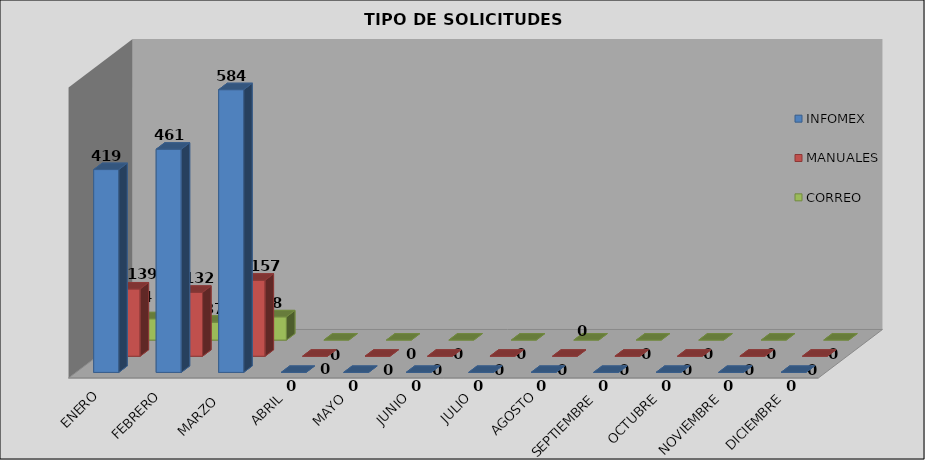
| Category | INFOMEX | MANUALES | CORREO |
|---|---|---|---|
| ENERO | 419 | 139 | 44 |
| FEBRERO | 461 | 132 | 37 |
| MARZO  | 584 | 157 | 48 |
| ABRIL | 0 | 0 | 0 |
| MAYO | 0 | 0 | 0 |
| JUNIO | 0 | 0 | 0 |
| JULIO | 0 | 0 | 0 |
| AGOSTO | 0 | 0 | 0 |
| SEPTIEMBRE | 0 | 0 | 0 |
| OCTUBRE | 0 | 0 | 0 |
| NOVIEMBRE | 0 | 0 | 0 |
| DICIEMBRE | 0 | 0 | 0 |